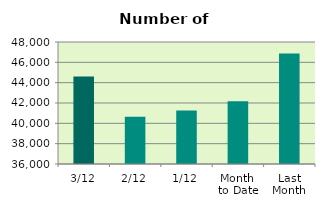
| Category | Series 0 |
|---|---|
| 3/12 | 44598 |
| 2/12 | 40642 |
| 1/12 | 41270 |
| Month 
to Date | 42170 |
| Last
Month | 46860.952 |